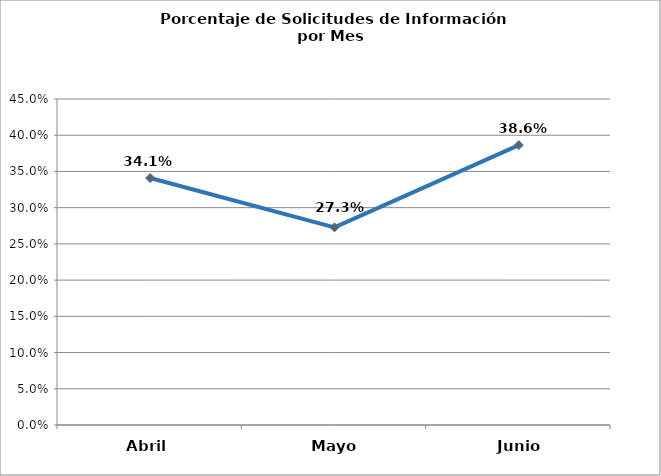
| Category | Series 0 |
|---|---|
| Abril | 0.341 |
| Mayo | 0.273 |
| Junio | 0.386 |